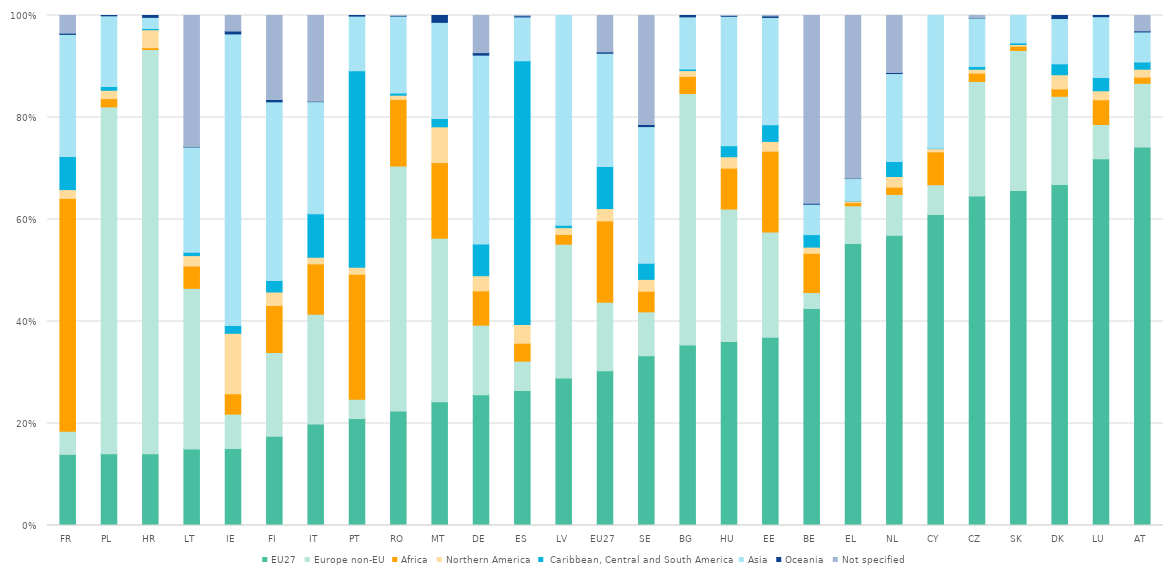
| Category | EU27 | Europe non-EU | Africa | Northern America |  Caribbean, Central and South America | Asia | Oceania | Not specified |
|---|---|---|---|---|---|---|---|---|
| FR | 13.952 | 4.53 | 45.659 | 1.721 | 6.498 | 23.932 | 0.245 | 3.464 |
| PL | 14.067 | 68.02 | 1.624 | 1.624 | 0.747 | 13.852 | 0.065 | 0 |
| HR | 14.078 | 79.248 | 0.364 | 3.519 | 0.243 | 2.184 | 0.364 | 0 |
| LT | 14.981 | 31.518 | 4.377 | 2.043 | 0.681 | 20.623 | 0.097 | 25.681 |
| IE | 15.1 | 6.743 | 3.97 | 11.874 | 1.506 | 57.191 | 0.567 | 3.048 |
| FI | 17.496 | 16.421 | 9.212 | 2.656 | 2.234 | 35.055 | 0.464 | 16.463 |
| IT | 19.921 | 21.524 | 9.849 | 1.302 | 8.543 | 21.966 | 0.073 | 16.823 |
| PT | 20.974 | 3.773 | 24.515 | 1.391 | 38.512 | 10.708 | 0.126 | 0 |
| RO | 22.463 | 48.017 | 13.072 | 0.816 | 0.455 | 15.045 | 0.095 | 0.038 |
| MT | 24.259 | 32.075 | 14.825 | 7.008 | 1.617 | 18.868 | 1.348 | 0 |
| DE | 25.63 | 13.658 | 6.718 | 2.966 | 6.23 | 37.024 | 0.492 | 7.283 |
| ES | 26.472 | 5.753 | 3.517 | 3.672 | 51.706 | 8.601 | 0.217 | 0.063 |
| LV | 28.924 | 26.233 | 1.906 | 1.345 | 0.448 | 41.143 | 0 | 0 |
| EU27 | 30.331 | 13.455 | 15.936 | 2.427 | 8.254 | 22.19 | 0.275 | 7.132 |
| SE | 33.288 | 8.603 | 4.037 | 2.33 | 3.184 | 26.771 | 0.434 | 21.352 |
| BG | 35.396 | 49.294 | 3.366 | 1.14 | 0.326 | 10.206 | 0.271 | 0 |
| HU | 36.068 | 25.983 | 8.013 | 2.244 | 2.158 | 25.363 | 0.15 | 0.021 |
| EE | 36.888 | 20.653 | 15.85 | 1.921 | 3.266 | 21.037 | 0.288 | 0.096 |
| BE | 42.543 | 3.133 | 7.687 | 1.223 | 2.445 | 5.967 | 0.183 | 36.818 |
| EL | 55.302 | 7.384 | 0.628 | 0.314 | 0.079 | 4.321 | 0.079 | 31.893 |
| NL | 56.901 | 8.016 | 1.421 | 2.087 | 2.951 | 17.241 | 0.198 | 11.184 |
| CY | 60.987 | 5.83 | 6.457 | 0.628 | 0.09 | 26.009 | 0 | 0 |
| CZ | 64.611 | 22.465 | 1.624 | 0.761 | 0.557 | 9.495 | 0.045 | 0.443 |
| SK | 65.691 | 27.455 | 0.842 | 0.321 | 0.321 | 5.371 | 0 | 0 |
| DK | 66.863 | 17.299 | 1.442 | 2.782 | 2.139 | 8.879 | 0.597 | 0 |
| LU | 71.901 | 6.73 | 4.841 | 1.771 | 2.597 | 11.924 | 0.236 | 0 |
| AT | 74.195 | 12.509 | 1.212 | 1.556 | 1.409 | 5.89 | 0.213 | 3.015 |